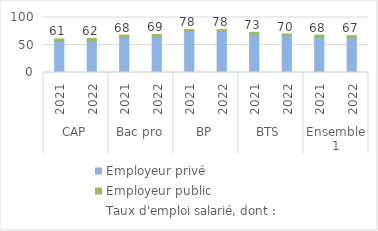
| Category | Employeur privé | Employeur public | Taux d'emploi salarié, dont : |
|---|---|---|---|
| 0 | 57 | 4 | 61 |
| 1 | 58 | 4 | 62 |
| 2 | 65 | 3 | 68 |
| 3 | 66 | 3 | 69 |
| 4 | 76 | 2 | 78 |
| 5 | 75 | 3 | 78 |
| 6 | 70 | 3 | 73 |
| 7 | 67 | 3 | 70 |
| 8 | 64 | 4 | 68 |
| 9 | 63 | 4 | 67 |